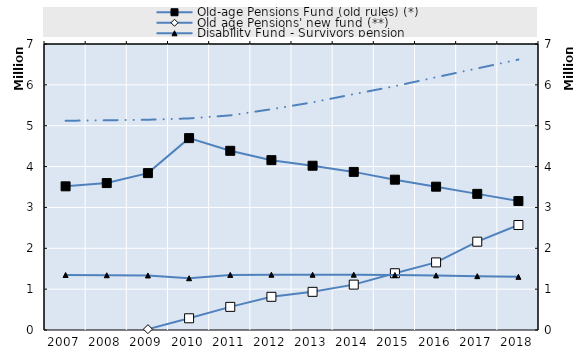
| Category | Old-age Pensions Fund (old rules) (*) | Old age Pensions' new fund (**) |
|---|---|---|
| 2007.0 | 3516070 | 0 |
| 2008.0 | 3596507 | 0 |
| 2009.0 | 3839932 | 20594 |
| 2010.0 | 4696392 | 287187 |
| 2011.0 | 4386022 | 566237 |
| 2012.0 | 4157304 | 812450 |
| 2013.0 | 4020139 | 934193 |
| 2014.0 | 3869877 | 1110688 |
| 2015.0 | 3679091 | 1388639 |
| 2016.0 | 3507809 | 1654471 |
| 2017.0 | 3331990 | 2161806 |
| 2018.0 | 3156152 | 2569922 |